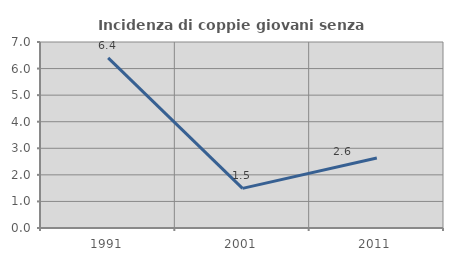
| Category | Incidenza di coppie giovani senza figli |
|---|---|
| 1991.0 | 6.4 |
| 2001.0 | 1.493 |
| 2011.0 | 2.632 |